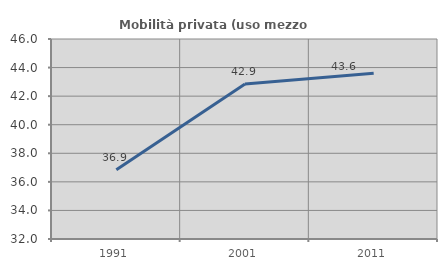
| Category | Mobilità privata (uso mezzo privato) |
|---|---|
| 1991.0 | 36.851 |
| 2001.0 | 42.857 |
| 2011.0 | 43.604 |